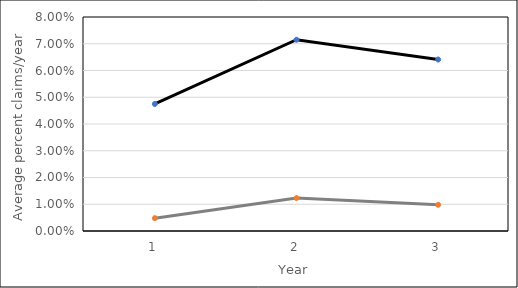
| Category | 7-asthma | 6-AD |
|---|---|---|
| 0 | 0.048 | 0.005 |
| 1 | 0.072 | 0.012 |
| 2 | 0.064 | 0.01 |